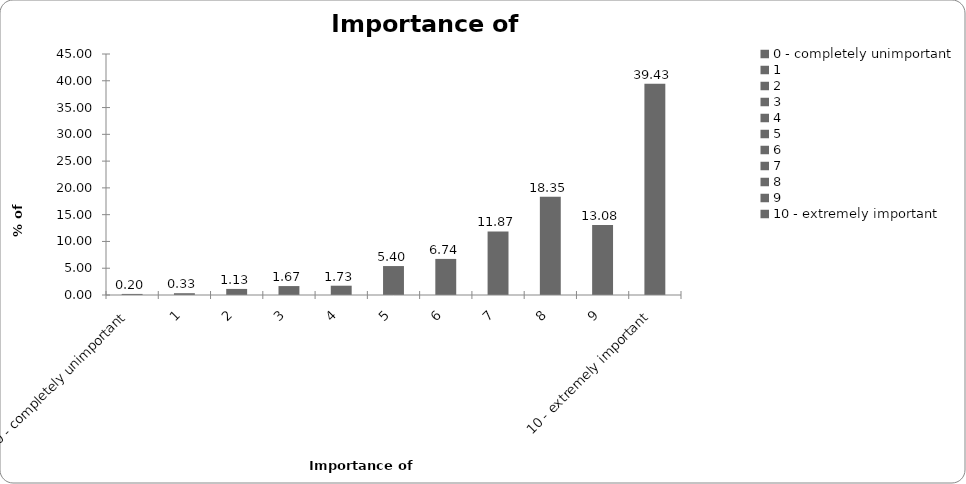
| Category | Importance of insurance |
|---|---|
| 0 - completely unimportant | 0.2 |
| 1 | 0.334 |
| 2 | 1.134 |
| 3 | 1.668 |
| 4 | 1.734 |
| 5 | 5.404 |
| 6 | 6.738 |
| 7 | 11.875 |
| 8 | 18.346 |
| 9 | 13.075 |
| 10 - extremely important | 39.426 |